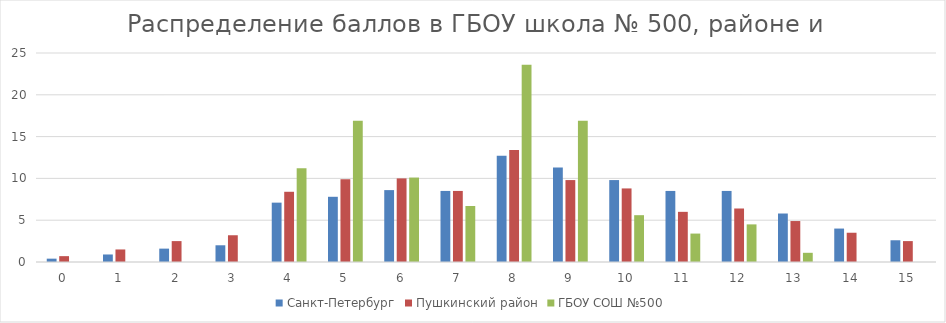
| Category | Санкт-Петербург | Пушкинский район | ГБОУ СОШ №500 |
|---|---|---|---|
| 0.0 | 0.4 | 0.7 | 0 |
| 1.0 | 0.9 | 1.5 | 0 |
| 2.0 | 1.6 | 2.5 | 0 |
| 3.0 | 2 | 3.2 | 0 |
| 4.0 | 7.1 | 8.4 | 11.2 |
| 5.0 | 7.8 | 9.9 | 16.9 |
| 6.0 | 8.6 | 10 | 10.1 |
| 7.0 | 8.5 | 8.5 | 6.7 |
| 8.0 | 12.7 | 13.4 | 23.6 |
| 9.0 | 11.3 | 9.8 | 16.9 |
| 10.0 | 9.8 | 8.8 | 5.6 |
| 11.0 | 8.5 | 6 | 3.4 |
| 12.0 | 8.5 | 6.4 | 4.5 |
| 13.0 | 5.8 | 4.9 | 1.1 |
| 14.0 | 4 | 3.5 | 0 |
| 15.0 | 2.6 | 2.5 | 0 |